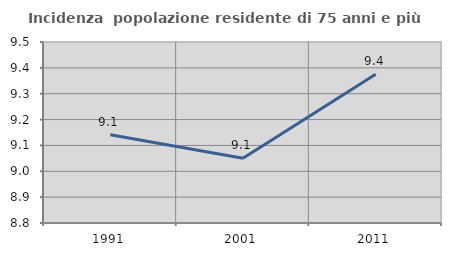
| Category | Incidenza  popolazione residente di 75 anni e più |
|---|---|
| 1991.0 | 9.142 |
| 2001.0 | 9.051 |
| 2011.0 | 9.375 |